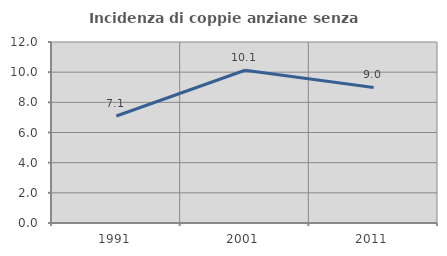
| Category | Incidenza di coppie anziane senza figli  |
|---|---|
| 1991.0 | 7.092 |
| 2001.0 | 10.127 |
| 2011.0 | 8.989 |